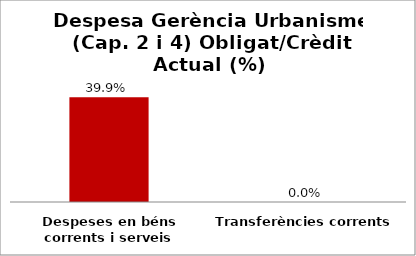
| Category | Series 0 |
|---|---|
| Despeses en béns corrents i serveis | 0.399 |
| Transferències corrents | 0 |